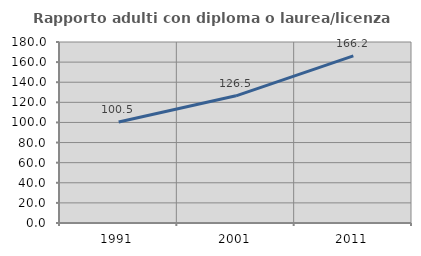
| Category | Rapporto adulti con diploma o laurea/licenza media  |
|---|---|
| 1991.0 | 100.481 |
| 2001.0 | 126.501 |
| 2011.0 | 166.173 |